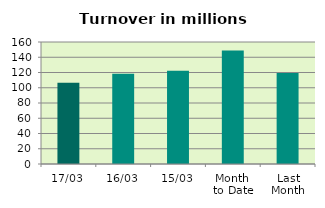
| Category | Series 0 |
|---|---|
| 17/03 | 106.641 |
| 16/03 | 118.288 |
| 15/03 | 122.277 |
| Month 
to Date | 148.8 |
| Last
Month | 119.242 |